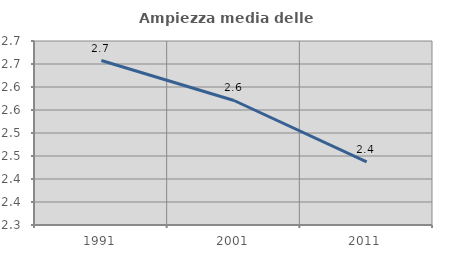
| Category | Ampiezza media delle famiglie |
|---|---|
| 1991.0 | 2.658 |
| 2001.0 | 2.571 |
| 2011.0 | 2.437 |